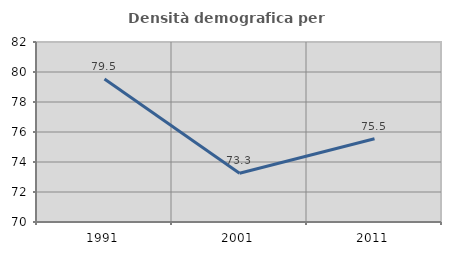
| Category | Densità demografica |
|---|---|
| 1991.0 | 79.54 |
| 2001.0 | 73.254 |
| 2011.0 | 75.545 |